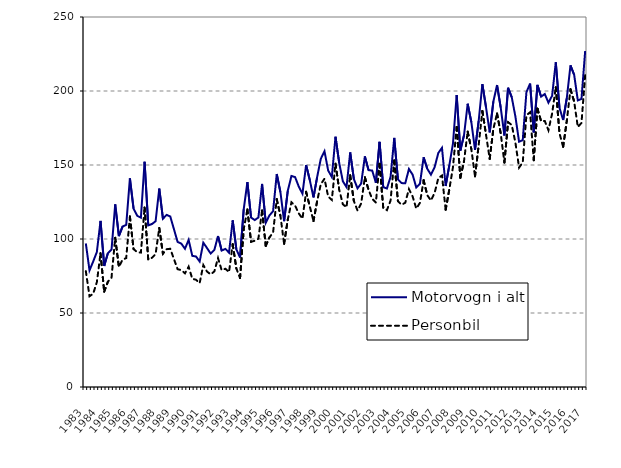
| Category | Motorvogn i alt | Personbil |
|---|---|---|
| 1983.0 | 97 | 78.3 |
| nan | 78.8 | 61.3 |
| nan | 84.8 | 63 |
| nan | 91.2 | 70.8 |
| 1984.0 | 112.2 | 90.4 |
| nan | 81.8 | 64.4 |
| nan | 90.4 | 71.1 |
| nan | 92.9 | 73.9 |
| 1985.0 | 123.4 | 100.8 |
| nan | 102 | 81.1 |
| nan | 108.4 | 86 |
| nan | 109.6 | 87.1 |
| 1986.0 | 141 | 115.2 |
| nan | 120.5 | 93.2 |
| nan | 115.7 | 91.1 |
| nan | 114.4 | 90.8 |
| 1987.0 | 152.2 | 121.3 |
| nan | 109.2 | 86.1 |
| nan | 110.1 | 87.3 |
| nan | 112 | 89.8 |
| 1988.0 | 134.1 | 107.5 |
| nan | 113.7 | 90 |
| nan | 116.3 | 93.1 |
| nan | 115.2 | 93.4 |
| 1989.0 | 106.6 | 86.4 |
| nan | 98 | 79.6 |
| nan | 96.9 | 79 |
| nan | 93.4 | 76.8 |
| 1990.0 | 99.4 | 81.3 |
| nan | 88.6 | 73.1 |
| nan | 88.2 | 72.5 |
| nan | 84.8 | 70.2 |
| 1991.0 | 97.5 | 82.4 |
| nan | 93.9 | 78 |
| nan | 90.2 | 76.1 |
| nan | 92.6 | 78.1 |
| 1992.0 | 102 | 87.1 |
| nan | 92.2 | 78.9 |
| nan | 93.3 | 79.9 |
| nan | 90.8 | 77.6 |
| 1993.0 | 112.6 | 96.5 |
| nan | 93 | 80.1 |
| nan | 87.5 | 73.6 |
| nan | 120.1 | 106.6 |
| 1994.0 | 138.4 | 120 |
| nan | 114.5 | 98.1 |
| nan | 112.8 | 98.8 |
| nan | 114.5 | 100.2 |
| 1995.0 | 137.2 | 119.3 |
| nan | 111 | 95.4 |
| nan | 115.9 | 101 |
| nan | 118.8 | 104.4 |
| 1996.0 | 143.9 | 126.9 |
| nan | 131.6 | 115.7 |
| nan | 112 | 96.7 |
| nan | 132.5 | 113.1 |
| 1997.0 | 142.6 | 124.8 |
| nan | 141.8 | 122.5 |
| nan | 135.4 | 117.3 |
| nan | 130.6 | 113.7 |
| 1998.0 | 150 | 131.9 |
| nan | 139.8 | 122 |
| nan | 128.1 | 112.1 |
| nan | 141.8 | 125.6 |
| 1999.0 | 154.2 | 137.1 |
| nan | 159.3 | 140.7 |
| nan | 146.3 | 128.7 |
| nan | 141.9 | 126.4 |
| 2000.0 | 169.1 | 150.9 |
| nan | 151.5 | 133.4 |
| nan | 139 | 123.5 |
| nan | 135.1 | 121.4 |
| 2001.0 | 158.5 | 143.1 |
| nan | 140.46 | 125.7 |
| nan | 134.24 | 119.2 |
| nan | 137.495 | 124.072 |
| 2002.0 | 155.814 | 141.724 |
| nan | 146.543 | 133.19 |
| nan | 146.231 | 127.141 |
| nan | 137.967 | 124.641 |
| 2003.0 | 165.679 | 150.811 |
| nan | 135.021 | 121.101 |
| nan | 134.111 | 119.491 |
| nan | 142.013 | 125.959 |
| 2004.0 | 168.309 | 153.043 |
| nan | 140.267 | 125.568 |
| nan | 137.77 | 123.121 |
| nan | 137.685 | 124.506 |
| 2005.0 | 147.311 | 133.756 |
| nan | 143.517 | 128.79 |
| nan | 134.783 | 120.571 |
| nan | 137.37 | 124.382 |
| 2006.0 | 155.213 | 139.728 |
| nan | 147.444 | 129.572 |
| nan | 143.451 | 126.006 |
| nan | 148.561 | 131.195 |
| 2007.0 | 158.1 | 141.084 |
| nan | 161.613 | 142.897 |
| nan | 135.821 | 119.753 |
| nan | 149.791 | 133.498 |
| 2008.0 | 164.642 | 148.614 |
| nan | 197.287 | 175.714 |
| nan | 159.718 | 141.407 |
| nan | 170.057 | 152.54 |
| 2009.0 | 191.38 | 172.559 |
| nan | 178.906 | 160.765 |
| nan | 160.234 | 142.312 |
| nan | 179.857 | 163.532 |
| 2010.0 | 204.636 | 186.507 |
| nan | 188.957 | 170.463 |
| nan | 172.077 | 154.156 |
| nan | 192.961 | 174.399 |
| 2011.0 | 204.005 | 184.86 |
| nan | 188.741 | 171.333 |
| nan | 169.934 | 151.694 |
| nan | 202.176 | 178.919 |
| 2012.0 | 195.829 | 177.072 |
| nan | 182.751 | 165.128 |
| nan | 165.73 | 148.242 |
| nan | 166.805 | 151.728 |
| 2013.0 | 199.181 | 183.653 |
| nan | 205.015 | 185.634 |
| nan | 172.044 | 153.21 |
| nan | 204.1 | 188.079 |
| 2014.0 | 196.177 | 179.552 |
| nan | 197.965 | 179.767 |
| nan | 192.105 | 173.474 |
| nan | 196.809 | 184.739 |
| 2015.0 | 219.419 | 202.592 |
| nan | 188.696 | 171.451 |
| nan | 180.388 | 162.297 |
| nan | 195.23 | 179.891 |
| 2016.0 | 217.298 | 201.197 |
| nan | 210.949 | 192.893 |
| nan | 193.648 | 175.642 |
| nan | 194.663 | 178.455 |
| 2017.0 | 227.029 | 210.738 |